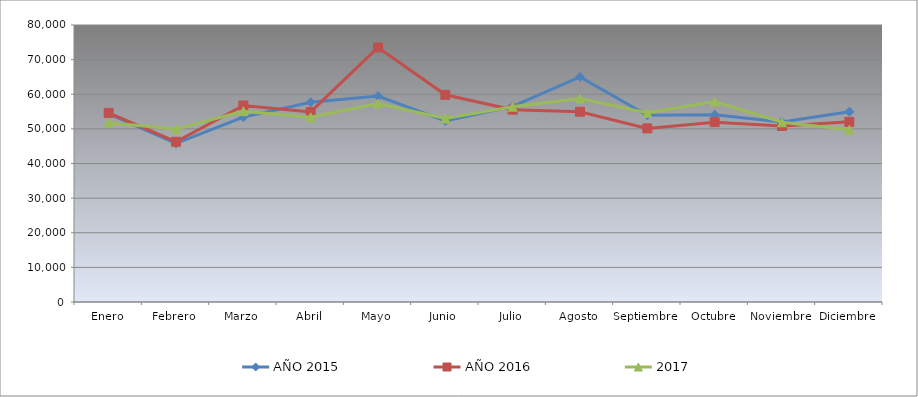
| Category | AÑO 2015 | AÑO 2016 | 2017 |
|---|---|---|---|
| Enero | 54298.333 | 54629.877 | 51792.071 |
| Febrero | 45792.571 | 46285.799 | 49938.25 |
| Marzo | 53388.816 | 56755.067 | 55106.631 |
| Abril | 57699.283 | 54899.901 | 53336.09 |
| Mayo | 59484.443 | 73501.561 | 57326.886 |
| Junio | 52315.01 | 59833.675 | 52974.653 |
| Julio | 56491.675 | 55548.292 | 56417.464 |
| Agosto | 64988.969 | 54946.572 | 58739.321 |
| Septiembre | 53937.575 | 50141.143 | 54630.267 |
| Octubre | 54081.54 | 51937.97 | 57864.877 |
| Noviembre | 51988.126 | 50846.206 | 51900.336 |
| Diciembre | 54969.038 | 52022.977 | 49748.371 |